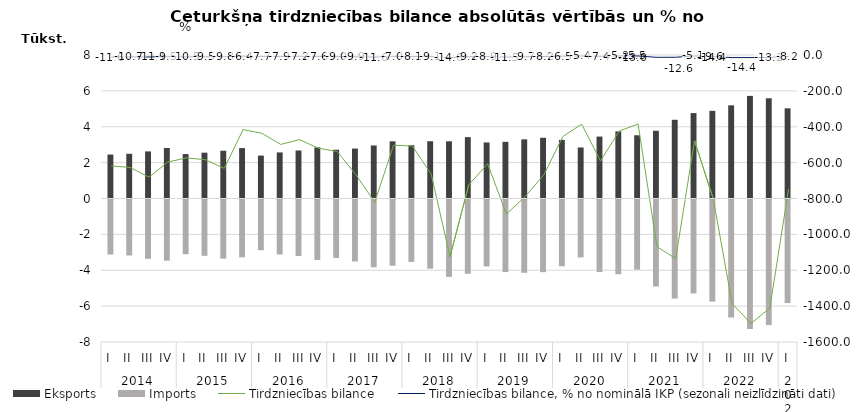
| Category | Eksports | Imports |
|---|---|---|
| 0 | 2450.7 | -3068.8 |
| 1 | 2493.4 | -3120.5 |
| 2 | 2625.5 | -3306.5 |
| 3 | 2816.7 | -3413.2 |
| 4 | 2476.5 | -3050.1 |
| 5 | 2555.2 | -3139.2 |
| 6 | 2663.4 | -3295.5 |
| 7 | 2809.5 | -3225.4 |
| 8 | 2391.5 | -2828.1 |
| 9 | 2569.5 | -3068 |
| 10 | 2678.2 | -3149.9 |
| 11 | 2850.8 | -3370.5 |
| 12 | 2719.6 | -3257.4 |
| 13 | 2783.8 | -3452 |
| 14 | 2956.9 | -3777.4 |
| 15 | 3187 | -3690 |
| 16 | 2969.9 | -3477.4 |
| 17 | 3193.3 | -3857.4 |
| 18 | 3189.7 | -4313.9 |
| 19 | 3420.5 | -4144.2 |
| 20 | 3123.6 | -3730.2 |
| 21 | 3158.2 | -4044.8 |
| 22 | 3298.5 | -4087.5 |
| 23 | 3385.3 | -4051.1 |
| 24 | 3266.4 | -3720.9 |
| 25 | 2842.7 | -3228.3 |
| 26 | 3452.8 | -4043.7 |
| 27 | 3742.7 | -4166.6 |
| 28 | 3526.2 | -3910.7 |
| 29 | 3776 | -4844.9 |
| 30 | 4388.7 | -5523.8 |
| 31 | 4761.5 | -5239.5 |
| 32 | 4886.7 | -5690.3 |
| 33 | 5194.3 | -6581.5 |
| 34 | 5721.7 | -7217.9 |
| 35 | 5588.1 | -6999.8 |
| 36 | 5027.3 | -5773.9 |